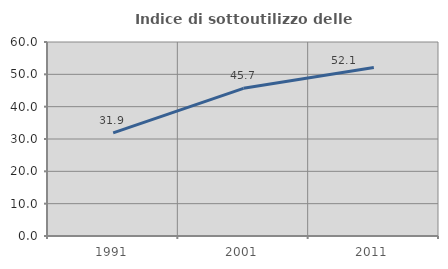
| Category | Indice di sottoutilizzo delle abitazioni  |
|---|---|
| 1991.0 | 31.902 |
| 2001.0 | 45.679 |
| 2011.0 | 52.117 |